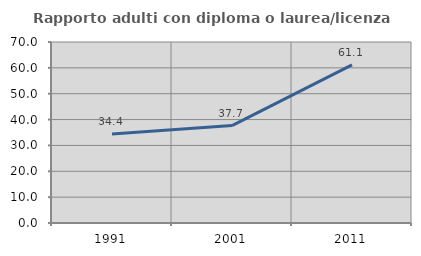
| Category | Rapporto adulti con diploma o laurea/licenza media  |
|---|---|
| 1991.0 | 34.444 |
| 2001.0 | 37.681 |
| 2011.0 | 61.143 |